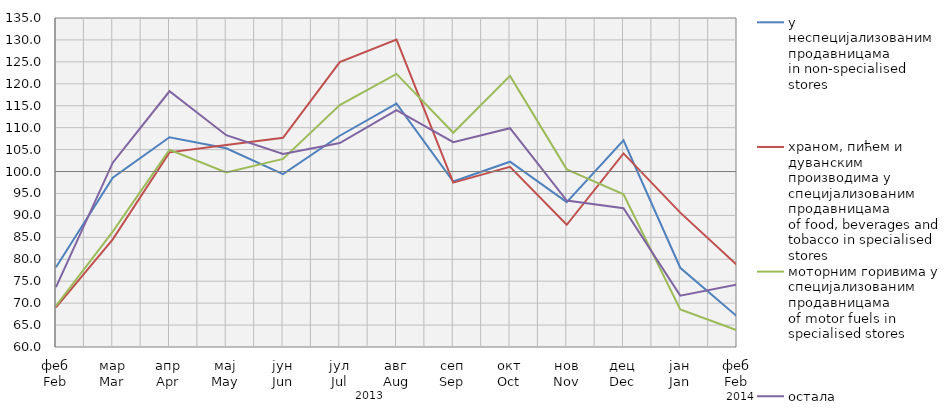
| Category | у неспецијализованим продавницама
in non-specialised stores | храном, пићем и дуванским производима у специјализовaним продавницама
of food, beverages and tobacco in specialised stores | моторним горивима у специјализованим продавницама
of motor fuels in specialised stores | остала
other |
|---|---|---|---|---|
| феб
Feb | 78.167 | 69.014 | 69.357 | 73.639 |
| мар
Mar | 98.6 | 84.535 | 86.311 | 102.025 |
| апр
Apr | 107.82 | 104.374 | 104.963 | 118.299 |
| мај
May | 105.292 | 106.059 | 99.786 | 108.286 |
| јун
Jun | 99.408 | 107.704 | 102.888 | 103.986 |
| јул
Jul | 108.16 | 124.929 | 115.152 | 106.482 |
| авг
Aug | 115.48 | 130.093 | 122.253 | 113.997 |
| сеп
Sep | 97.717 | 97.467 | 108.827 | 106.7 |
| окт
Oct | 102.24 | 101.077 | 121.799 | 109.868 |
| нов
Nov | 93.024 | 87.862 | 100.498 | 93.38 |
| дец
Dec | 107.124 | 104.135 | 94.83 | 91.634 |
| јан
Jan | 78.06 | 90.633 | 68.559 | 71.709 |
| феб
Feb | 66.985 | 78.662 | 63.807 | 74.254 |